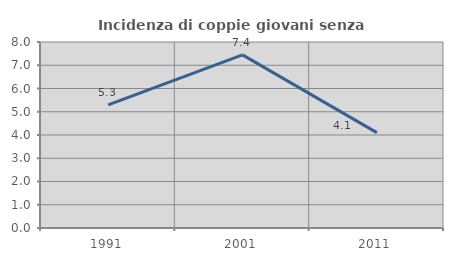
| Category | Incidenza di coppie giovani senza figli |
|---|---|
| 1991.0 | 5.294 |
| 2001.0 | 7.447 |
| 2011.0 | 4.103 |